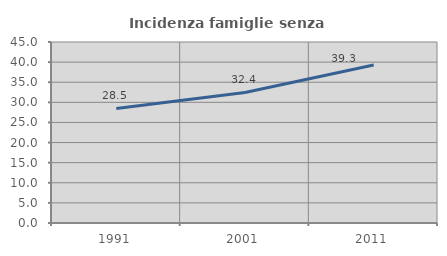
| Category | Incidenza famiglie senza nuclei |
|---|---|
| 1991.0 | 28.482 |
| 2001.0 | 32.449 |
| 2011.0 | 39.266 |